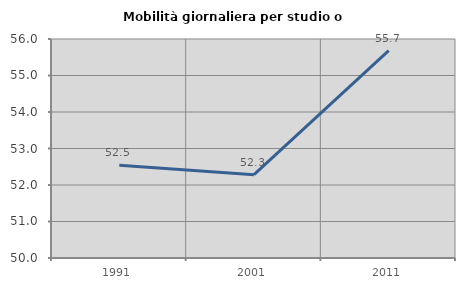
| Category | Mobilità giornaliera per studio o lavoro |
|---|---|
| 1991.0 | 52.54 |
| 2001.0 | 52.284 |
| 2011.0 | 55.683 |